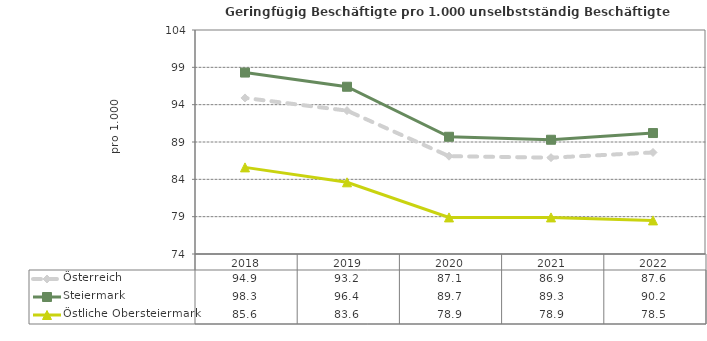
| Category | Österreich | Steiermark | Östliche Obersteiermark |
|---|---|---|---|
| 2022.0 | 87.6 | 90.2 | 78.5 |
| 2021.0 | 86.9 | 89.3 | 78.9 |
| 2020.0 | 87.1 | 89.7 | 78.9 |
| 2019.0 | 93.2 | 96.4 | 83.6 |
| 2018.0 | 94.9 | 98.3 | 85.6 |